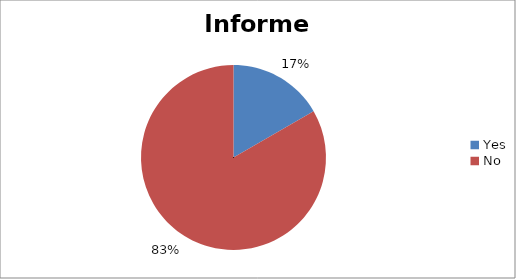
| Category | Informed |
|---|---|
| Yes | 10 |
| No | 50 |